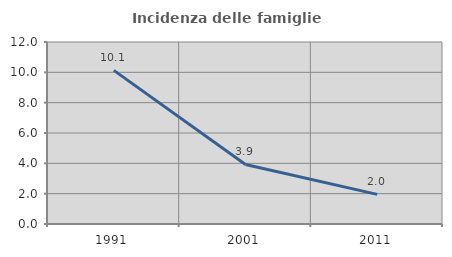
| Category | Incidenza delle famiglie numerose |
|---|---|
| 1991.0 | 10.13 |
| 2001.0 | 3.928 |
| 2011.0 | 1.956 |